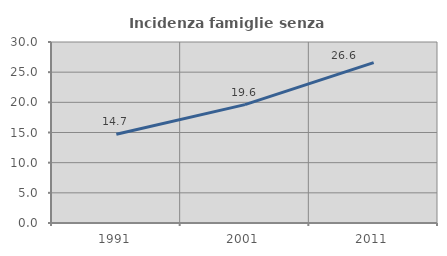
| Category | Incidenza famiglie senza nuclei |
|---|---|
| 1991.0 | 14.716 |
| 2001.0 | 19.622 |
| 2011.0 | 26.587 |